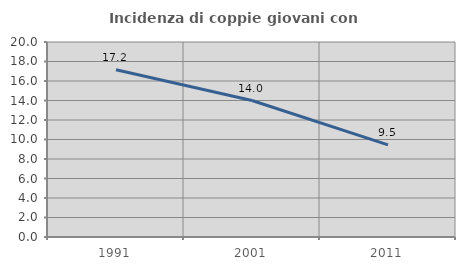
| Category | Incidenza di coppie giovani con figli |
|---|---|
| 1991.0 | 17.16 |
| 2001.0 | 13.996 |
| 2011.0 | 9.452 |